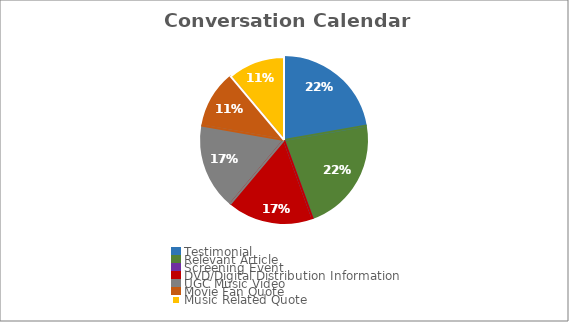
| Category | Series 0 |
|---|---|
| Testimonial | 0.222 |
| Relevant Article | 0.222 |
| Screening Event | 0 |
| DVD/Digital Distribution Information | 0.167 |
| UGC Music Video | 0.167 |
| Movie Fan Quote | 0.111 |
| Music Related Quote | 0.111 |